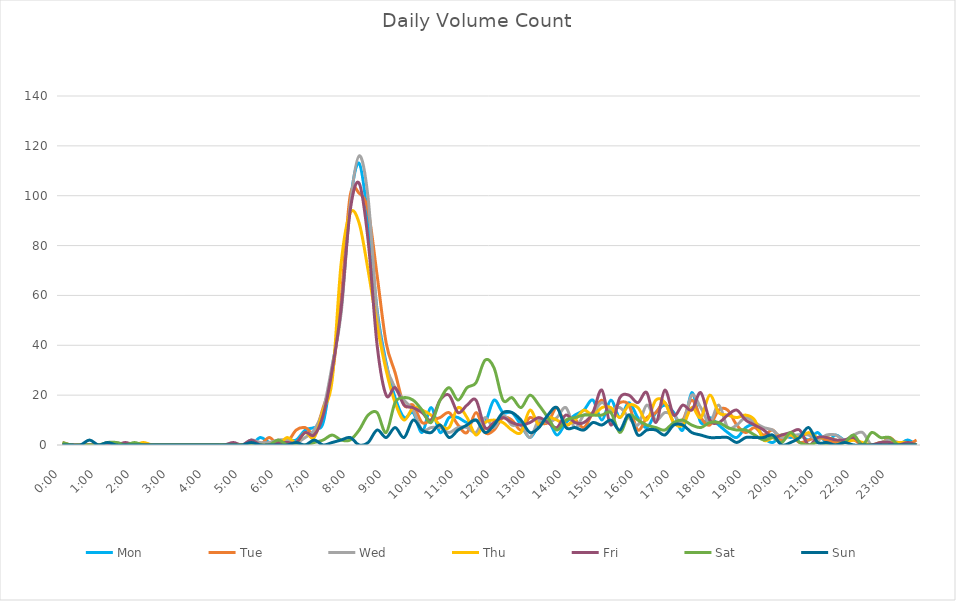
| Category | Mon | Tue | Wed | Thu | Fri | Sat | Sun |
|---|---|---|---|---|---|---|---|
| 0.0 | 0 | 1 | 0 | 0 | 0 | 1 | 0 |
| 0.0104166666666667 | 0 | 0 | 0 | 0 | 0 | 0 | 0 |
| 0.0208333333333333 | 0 | 0 | 0 | 0 | 0 | 0 | 0 |
| 0.03125 | 0 | 0 | 0 | 0 | 0 | 0 | 2 |
| 0.0416666666666667 | 0 | 0 | 0 | 0 | 0 | 0 | 0 |
| 0.0520833333333333 | 0 | 0 | 0 | 0 | 0 | 1 | 1 |
| 0.0625 | 0 | 0 | 1 | 0 | 0 | 1 | 0 |
| 0.0729166666666667 | 0 | 0 | 0 | 0 | 1 | 0 | 0 |
| 0.0833333333333333 | 0 | 0 | 0 | 0 | 0 | 1 | 0 |
| 0.09375 | 0 | 0 | 0 | 1 | 0 | 0 | 0 |
| 0.104166666666667 | 0 | 0 | 0 | 0 | 0 | 0 | 0 |
| 0.114583333333333 | 0 | 0 | 0 | 0 | 0 | 0 | 0 |
| 0.125 | 0 | 0 | 0 | 0 | 0 | 0 | 0 |
| 0.135416666666667 | 0 | 0 | 0 | 0 | 0 | 0 | 0 |
| 0.145833333333333 | 0 | 0 | 0 | 0 | 0 | 0 | 0 |
| 0.15625 | 0 | 0 | 0 | 0 | 0 | 0 | 0 |
| 0.166666666666667 | 0 | 0 | 0 | 0 | 0 | 0 | 0 |
| 0.177083333333333 | 0 | 0 | 0 | 0 | 0 | 0 | 0 |
| 0.1875 | 0 | 0 | 0 | 0 | 0 | 0 | 0 |
| 0.197916666666667 | 0 | 0 | 0 | 0 | 1 | 0 | 0 |
| 0.208333333333333 | 0 | 0 | 0 | 0 | 0 | 0 | 0 |
| 0.21875 | 0 | 0 | 2 | 1 | 2 | 0 | 1 |
| 0.229166666666667 | 3 | 0 | 1 | 0 | 0 | 0 | 0 |
| 0.239583333333333 | 1 | 3 | 1 | 0 | 0 | 0 | 0 |
| 0.25 | 0 | 0 | 2 | 0 | 1 | 2 | 0 |
| 0.260416666666667 | 2 | 1 | 2 | 3 | 1 | 0 | 0 |
| 0.270833333333333 | 2 | 6 | 1 | 1 | 1 | 0 | 1 |
| 0.28125 | 6 | 7 | 3 | 5 | 5 | 0 | 0 |
| 0.291666666666667 | 7 | 5 | 6 | 3 | 4 | 1 | 2 |
| 0.302083333333333 | 9 | 15 | 14 | 14 | 12 | 2 | 0 |
| 0.3125 | 31 | 28 | 32 | 26 | 30 | 4 | 1 |
| 0.322916666666667 | 55 | 59 | 53 | 73 | 55 | 2 | 2 |
| 0.333333333333333 | 97 | 100 | 96 | 93 | 94 | 2 | 3 |
| 0.34375 | 113 | 101 | 116 | 89 | 105 | 6 | 0 |
| 0.354166666666667 | 90 | 94 | 99 | 70 | 82 | 12 | 1 |
| 0.364583333333333 | 54 | 68 | 53 | 48 | 40 | 13 | 6 |
| 0.375 | 33 | 41 | 32 | 30 | 20 | 5 | 3 |
| 0.385416666666667 | 19 | 29 | 23 | 17 | 23 | 17 | 7 |
| 0.395833333333333 | 11 | 16 | 18 | 10 | 16 | 19 | 3 |
| 0.40625 | 13 | 16 | 14 | 15 | 15 | 18 | 10 |
| 0.416666666666667 | 5 | 9 | 6 | 14 | 13 | 14 | 6 |
| 0.427083333333333 | 15 | 10 | 7 | 12 | 10 | 9 | 5 |
| 0.4375 | 5 | 11 | 7 | 8 | 18 | 18 | 8 |
| 0.447916666666667 | 11 | 13 | 5 | 7 | 20 | 23 | 3 |
| 0.458333333333333 | 11 | 8 | 7 | 15 | 13 | 18 | 6 |
| 0.46875 | 9 | 5 | 7 | 11 | 16 | 23 | 8 |
| 0.479166666666667 | 10 | 13 | 5 | 4 | 18 | 25 | 10 |
| 0.489583333333333 | 9 | 5 | 11 | 9 | 7 | 34 | 5 |
| 0.5 | 18 | 6 | 7 | 10 | 9 | 31 | 8 |
| 0.510416666666667 | 13 | 11 | 12 | 9 | 11 | 18 | 13 |
| 0.520833333333333 | 13 | 10 | 8 | 6 | 9 | 19 | 13 |
| 0.53125 | 8 | 6 | 8 | 5 | 8 | 15 | 10 |
| 0.541666666666667 | 3 | 11 | 3 | 14 | 9 | 20 | 5 |
| 0.552083333333333 | 8 | 9 | 10 | 8 | 11 | 16 | 7 |
| 0.5625 | 10 | 9 | 9 | 11 | 9 | 11 | 12 |
| 0.572916666666667 | 4 | 15 | 11 | 10 | 7 | 6 | 15 |
| 0.583333333333333 | 9 | 8 | 15 | 8 | 12 | 10 | 7 |
| 0.59375 | 12 | 10 | 7 | 10 | 9 | 11 | 7 |
| 0.604166666666667 | 14 | 7 | 12 | 14 | 9 | 12 | 6 |
| 0.614583333333333 | 18 | 13 | 13 | 12 | 13 | 12 | 9 |
| 0.625 | 10 | 18 | 17 | 15 | 22 | 12 | 8 |
| 0.635416666666667 | 18 | 13 | 14 | 15 | 8 | 13 | 10 |
| 0.645833333333333 | 11 | 17 | 15 | 11 | 19 | 5 | 6 |
| 0.65625 | 17 | 16 | 11 | 16 | 20 | 12 | 12 |
| 0.666666666666667 | 11 | 6 | 8 | 15 | 17 | 10 | 4 |
| 0.677083333333333 | 7 | 11 | 16 | 10 | 21 | 8 | 6 |
| 0.6875 | 13 | 13 | 10 | 18 | 9 | 7 | 6 |
| 0.697916666666667 | 16 | 17 | 13 | 17 | 22 | 6 | 4 |
| 0.708333333333333 | 13 | 9 | 12 | 9 | 12 | 9 | 8 |
| 0.71875 | 6 | 10 | 9 | 8 | 16 | 10 | 8 |
| 0.729166666666667 | 21 | 18 | 20 | 15 | 14 | 8 | 5 |
| 0.739583333333333 | 9 | 11 | 15 | 11 | 21 | 7 | 4 |
| 0.75 | 11 | 8 | 9 | 20 | 10 | 9 | 3 |
| 0.760416666666667 | 8 | 14 | 16 | 13 | 9 | 9 | 3 |
| 0.770833333333333 | 5 | 14 | 7 | 12 | 12 | 7 | 3 |
| 0.78125 | 3 | 8 | 8 | 11 | 14 | 6 | 1 |
| 0.791666666666667 | 7 | 5 | 11 | 12 | 10 | 6 | 3 |
| 0.802083333333333 | 8 | 7 | 9 | 10 | 8 | 4 | 3 |
| 0.8125 | 3 | 4 | 7 | 2 | 6 | 2 | 3 |
| 0.822916666666667 | 1 | 6 | 6 | 3 | 3 | 3 | 4 |
| 0.833333333333333 | 4 | 2 | 3 | 4 | 4 | 1 | 0 |
| 0.84375 | 3 | 4 | 4 | 4 | 5 | 5 | 1 |
| 0.854166666666667 | 4 | 1 | 4 | 3 | 6 | 1 | 3 |
| 0.864583333333333 | 2 | 2 | 4 | 5 | 0 | 0 | 7 |
| 0.875 | 5 | 3 | 2 | 3 | 3 | 1 | 1 |
| 0.885416666666667 | 1 | 2 | 4 | 3 | 3 | 0 | 1 |
| 0.895833333333333 | 4 | 1 | 4 | 2 | 2 | 0 | 0 |
| 0.90625 | 2 | 1 | 2 | 1 | 2 | 1 | 1 |
| 0.916666666666667 | 3 | 2 | 4 | 2 | 3 | 4 | 0 |
| 0.927083333333333 | 0 | 0 | 5 | 1 | 0 | 0 | 0 |
| 0.9375 | 0 | 0 | 0 | 0 | 0 | 5 | 0 |
| 0.947916666666667 | 0 | 0 | 1 | 1 | 1 | 3 | 0 |
| 0.958333333333333 | 0 | 3 | 2 | 1 | 1 | 3 | 0 |
| 0.96875 | 0 | 0 | 1 | 1 | 0 | 0 | 0 |
| 0.979166666666667 | 2 | 0 | 0 | 1 | 1 | 0 | 0 |
| 0.989583333333333 | 0 | 2 | 0 | 0 | 0 | 0 | 0 |